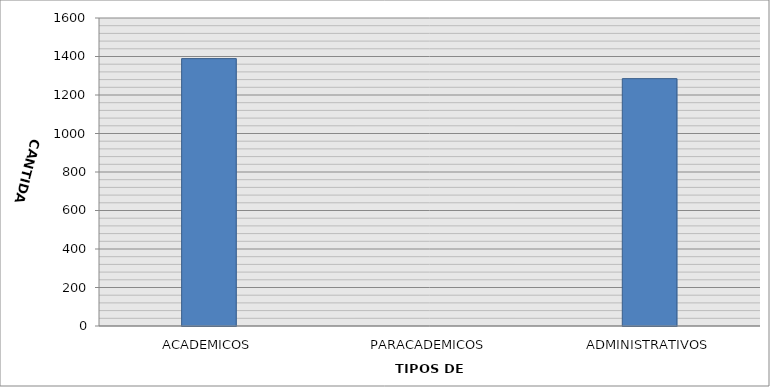
| Category | CANTIDAD |
|---|---|
| ACADEMICOS | 1389 |
| PARACADEMICOS | 0 |
| ADMINISTRATIVOS | 1285 |